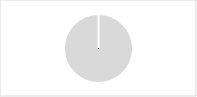
| Category | Central Med. |
|---|---|
| 0 | 311.369 |